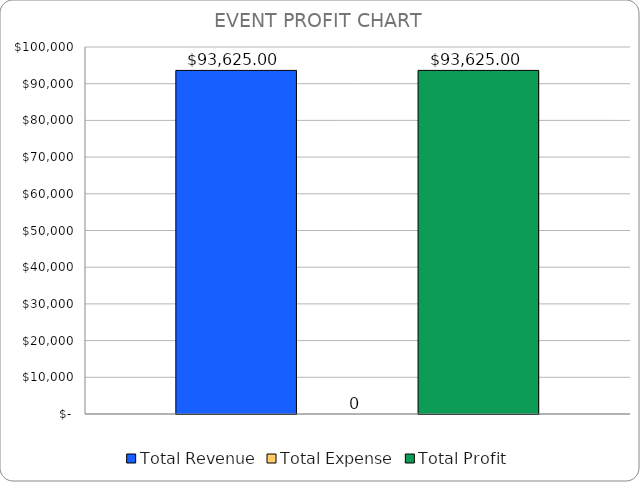
| Category | Total Revenue | Total Expense | Total Profit |
|---|---|---|---|
| TOTAL REVENUE | 93625 |  | 93625 |